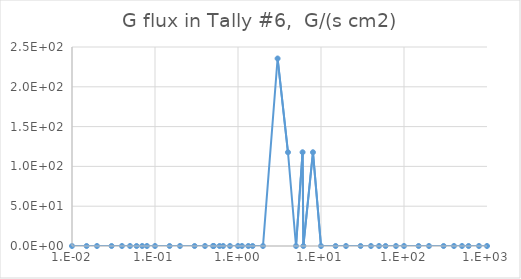
| Category | Series 0 |
|---|---|
| 0.01 | 0 |
| 0.015 | 0 |
| 0.02 | 0 |
| 0.03 | 0 |
| 0.04 | 0 |
| 0.05 | 0 |
| 0.06 | 0 |
| 0.07 | 0 |
| 0.08 | 0 |
| 0.1 | 0 |
| 0.15 | 0 |
| 0.2 | 0 |
| 0.3 | 0 |
| 0.4 | 0 |
| 0.5 | 0 |
| 0.6 | 0 |
| 0.8 | 0 |
| 1.0 | 0 |
| 1.5 | 0 |
| 2.0 | 0 |
| 3.0 | 235.534 |
| 4.0 | 117.767 |
| 5.0 | 0 |
| 6.0 | 117.767 |
| 8.0 | 58.884 |
| 10.0 | 0 |
| 15.0 | 0 |
| 20.0 | 0 |
| 30.0 | 0 |
| 40.0 | 0 |
| 50.0 | 0 |
| 60.0 | 0 |
| 80.0 | 0 |
| 100.0 | 0 |
| 150.0 | 0 |
| 200.0 | 0 |
| 300.0 | 0 |
| 400.0 | 0 |
| 500.0 | 0 |
| 600.0 | 0 |
| 800.0 | 0 |
| 1000.0 | 0 |
| 1500.0 | 0 |
| 2000.0 | 0 |
| 3000.0 | 0 |
| 4000.0 | 0 |
| 5000.0 | 0 |
| 6000.0 | 0 |
| 8000.0 | 0 |
| 10000.0 | 0 |